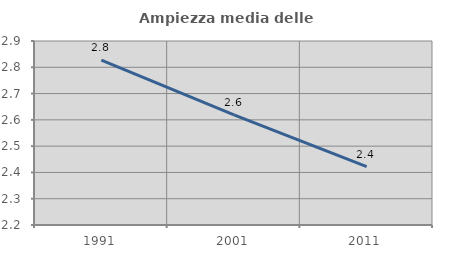
| Category | Ampiezza media delle famiglie |
|---|---|
| 1991.0 | 2.828 |
| 2001.0 | 2.619 |
| 2011.0 | 2.422 |